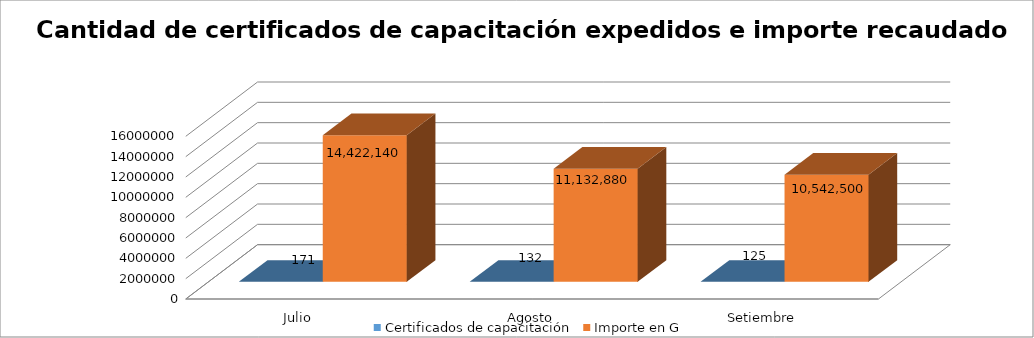
| Category | Certificados de capacitación | Importe en G |
|---|---|---|
| Julio  | 171 | 14422140 |
| Agosto | 132 | 11132880 |
| Setiembre | 125 | 10542500 |